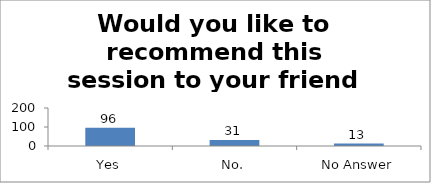
| Category | Would you like to recommend this session to your friend or colleague? |
|---|---|
| Yes | 96 |
| No. | 31 |
| No Answer | 13 |